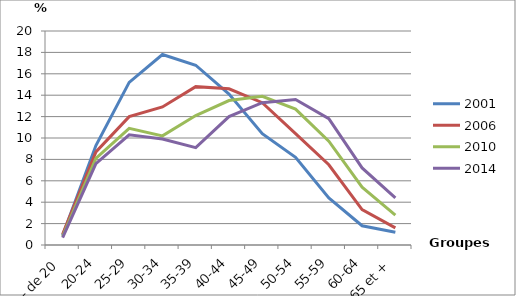
| Category | 2001 | 2006 | 2010 | 2014 |
|---|---|---|---|---|
| - de 20 | 0.9 | 1 | 0.8 | 0.7 |
| 20-24 | 9.3 | 8.7 | 8.1 | 7.6 |
| 25-29 | 15.2 | 12 | 10.9 | 10.3 |
| 30-34 | 17.8 | 12.9 | 10.2 | 9.9 |
| 35-39 | 16.8 | 14.8 | 12.1 | 9.1 |
| 40-44 | 14.1 | 14.6 | 13.5 | 12 |
| 45-49 | 10.4 | 13.3 | 13.9 | 13.3 |
| 50-54 | 8.2 | 10.4 | 12.7 | 13.6 |
| 55-59 | 4.4 | 7.5 | 9.7 | 11.8 |
| 60-64 | 1.8 | 3.3 | 5.4 | 7.2 |
| 65 et + | 1.2 | 1.6 | 2.8 | 4.4 |